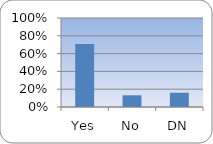
| Category | Series 0 |
|---|---|
| Yes | 0.708 |
| No | 0.131 |
| DN | 0.16 |